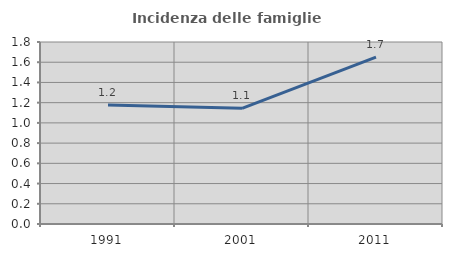
| Category | Incidenza delle famiglie numerose |
|---|---|
| 1991.0 | 1.177 |
| 2001.0 | 1.144 |
| 2011.0 | 1.651 |